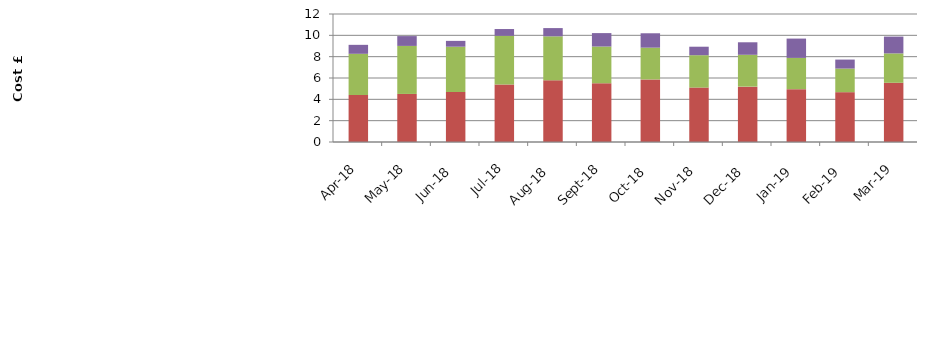
| Category | NBM - Frequency Response | NBM - Short-term operating reserve (STOR) | NBM - Fast Reserve |
|---|---|---|---|
| 2018-04-01 | 4.404 | 3.865 | 0.84 |
| 2018-05-01 | 4.506 | 4.502 | 0.92 |
| 2018-06-01 | 4.683 | 4.25 | 0.546 |
| 2018-07-01 | 5.402 | 4.555 | 0.634 |
| 2018-08-01 | 5.785 | 4.121 | 0.773 |
| 2018-09-01 | 5.508 | 3.443 | 1.259 |
| 2018-10-01 | 5.866 | 2.978 | 1.349 |
| 2018-11-01 | 5.104 | 3.033 | 0.796 |
| 2018-12-01 | 5.191 | 2.986 | 1.172 |
| 2019-01-01 | 4.955 | 2.93 | 1.811 |
| 2019-02-01 | 4.671 | 2.212 | 0.844 |
| 2019-03-01 | 5.552 | 2.755 | 1.576 |